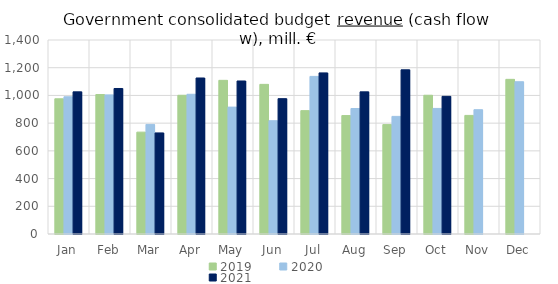
| Category | 2019 | 2020 | 2021 |
|---|---|---|---|
| Jan | 975697.728 | 990255.966 | 1025729.219 |
| Feb | 1006430.34 | 1003986.803 | 1050032.948 |
| Mar | 735133.085 | 790973.859 | 729450.354 |
| Apr | 1000972.718 | 1008343.173 | 1125852.842 |
| May | 1108859.129 | 915661.348 | 1104155.322 |
| Jun | 1079866 | 817524.851 | 976600.628 |
| Jul | 890279.006 | 1137278.065 | 1162632.002 |
| Aug | 854624.613 | 905597.447 | 1025720.022 |
| Sep | 789328.573 | 848822.405 | 1184851.081 |
| Oct | 1001284.261 | 906227.444 | 993429.183 |
| Nov | 855826.997 | 896995.399 | 0 |
| Dec | 1116052.897 | 1098839.178 | 0 |